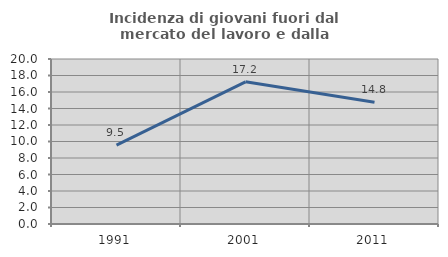
| Category | Incidenza di giovani fuori dal mercato del lavoro e dalla formazione  |
|---|---|
| 1991.0 | 9.549 |
| 2001.0 | 17.231 |
| 2011.0 | 14.762 |